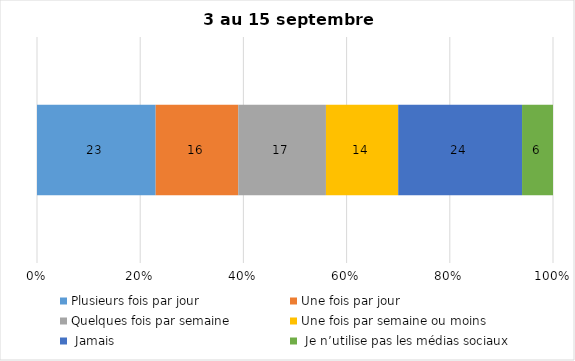
| Category | Plusieurs fois par jour | Une fois par jour | Quelques fois par semaine   | Une fois par semaine ou moins   |  Jamais   |  Je n’utilise pas les médias sociaux |
|---|---|---|---|---|---|---|
| 0 | 23 | 16 | 17 | 14 | 24 | 6 |